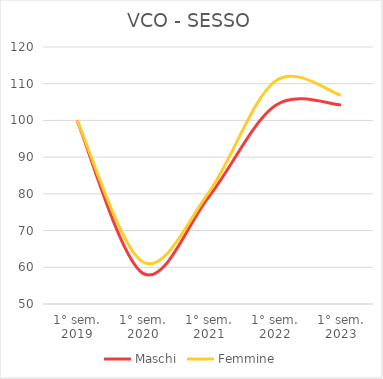
| Category | Maschi | Femmine |
|---|---|---|
| 1° sem.
2019 | 100 | 100 |
| 1° sem.
2020 | 58.344 | 61.439 |
| 1° sem.
2021 | 79.283 | 80.476 |
| 1° sem.
2022 | 104.005 | 110.64 |
| 1° sem.
2023 | 104.206 | 106.885 |